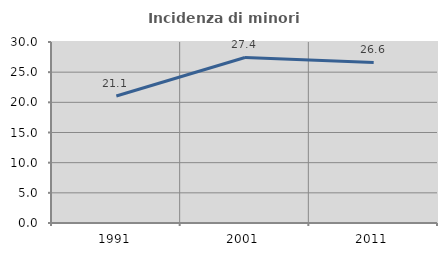
| Category | Incidenza di minori stranieri |
|---|---|
| 1991.0 | 21.053 |
| 2001.0 | 27.434 |
| 2011.0 | 26.62 |